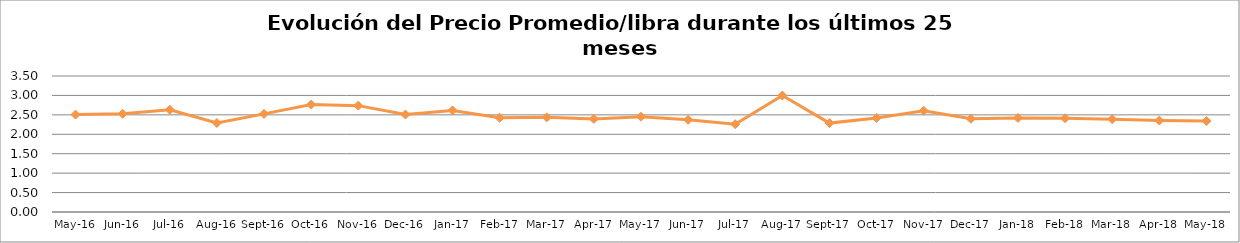
| Category | Series 0 |
|---|---|
| 2016-05-01 | 2.506 |
| 2016-06-01 | 2.527 |
| 2016-07-01 | 2.631 |
| 2016-08-01 | 2.292 |
| 2016-09-01 | 2.525 |
| 2016-10-01 | 2.764 |
| 2016-11-01 | 2.737 |
| 2016-12-01 | 2.508 |
| 2017-01-01 | 2.615 |
| 2017-02-01 | 2.424 |
| 2017-03-01 | 2.436 |
| 2017-04-01 | 2.396 |
| 2017-05-01 | 2.452 |
| 2017-06-01 | 2.372 |
| 2017-07-01 | 2.26 |
| 2017-08-01 | 2.997 |
| 2017-09-01 | 2.288 |
| 2017-10-01 | 2.421 |
| 2017-11-01 | 2.605 |
| 2017-12-01 | 2.4 |
| 2018-01-01 | 2.42 |
| 2018-02-01 | 2.412 |
| 2018-03-01 | 2.388 |
| 2018-04-01 | 2.352 |
| 2018-05-01 | 2.341 |